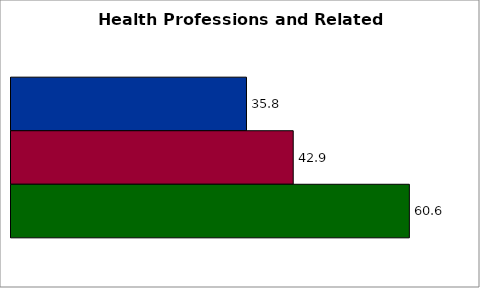
| Category | 50 states and D.C. | SREB states | State |
|---|---|---|---|
| 0 | 35.833 | 42.948 | 60.62 |